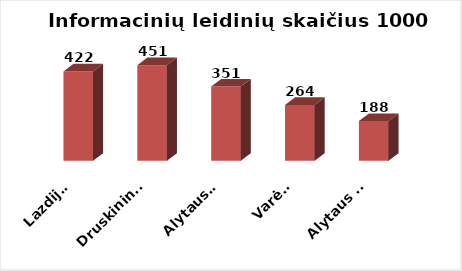
| Category | Series 0 |
|---|---|
| Lazdijai | 422.109 |
| Druskininkai | 451.462 |
| Alytaus r. | 350.786 |
| Varėna | 263.596 |
| Alytaus m. | 187.786 |